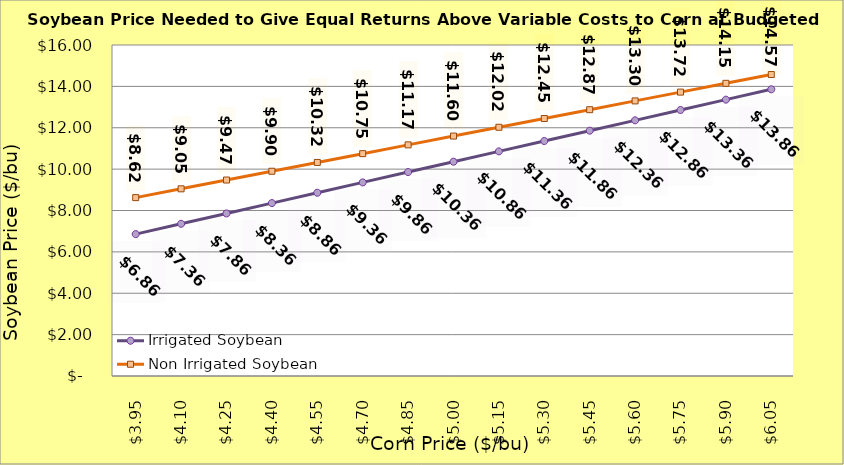
| Category | Irrigated Soybean | Non Irrigated Soybean |
|---|---|---|
| 3.949999999999998 | 6.858 | 8.623 |
| 4.099999999999998 | 7.358 | 9.048 |
| 4.249999999999998 | 7.858 | 9.473 |
| 4.399999999999999 | 8.358 | 9.898 |
| 4.549999999999999 | 8.858 | 10.323 |
| 4.699999999999999 | 9.358 | 10.748 |
| 4.85 | 9.858 | 11.173 |
| 5.0 | 10.358 | 11.598 |
| 5.15 | 10.858 | 12.023 |
| 5.300000000000001 | 11.358 | 12.448 |
| 5.450000000000001 | 11.858 | 12.873 |
| 5.600000000000001 | 12.358 | 13.298 |
| 5.750000000000002 | 12.858 | 13.723 |
| 5.900000000000002 | 13.358 | 14.148 |
| 6.0500000000000025 | 13.858 | 14.573 |